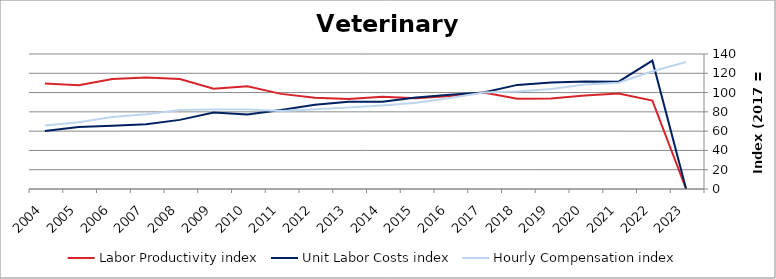
| Category | Labor Productivity index | Unit Labor Costs index | Hourly Compensation index |
|---|---|---|---|
| 2023.0 | 0 | 0 | 131.647 |
| 2022.0 | 91.747 | 133.079 | 122.097 |
| 2021.0 | 99.029 | 111.325 | 110.244 |
| 2020.0 | 97.015 | 111.604 | 108.273 |
| 2019.0 | 93.894 | 110.348 | 103.61 |
| 2018.0 | 93.569 | 107.965 | 101.022 |
| 2017.0 | 100 | 100 | 100 |
| 2016.0 | 96.552 | 97.673 | 94.305 |
| 2015.0 | 94.156 | 94.915 | 89.368 |
| 2014.0 | 95.781 | 90.402 | 86.588 |
| 2013.0 | 93.32 | 90.556 | 84.507 |
| 2012.0 | 94.691 | 87.353 | 82.716 |
| 2011.0 | 98.651 | 81.877 | 80.772 |
| 2010.0 | 106.621 | 77.28 | 82.396 |
| 2009.0 | 104.005 | 79.293 | 82.469 |
| 2008.0 | 114.156 | 71.68 | 81.827 |
| 2007.0 | 115.669 | 67.048 | 77.554 |
| 2006.0 | 113.98 | 65.606 | 74.778 |
| 2005.0 | 107.707 | 64.254 | 69.206 |
| 2004.0 | 109.295 | 60.187 | 65.782 |